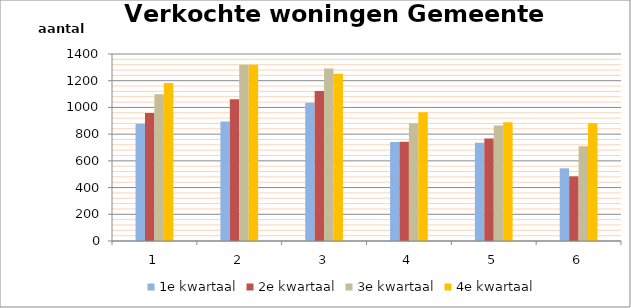
| Category | 1e kwartaal | 2e kwartaal | 3e kwartaal | 4e kwartaal |
|---|---|---|---|---|
| 0 | 877 | 959 | 1098 | 1182 |
| 1 | 894 | 1061 | 1319 | 1319 |
| 2 | 1035 | 1123 | 1292 | 1252 |
| 3 | 741 | 743 | 881 | 964 |
| 4 | 735 | 767 | 864 | 889 |
| 5 | 544 | 484 | 710 | 882 |